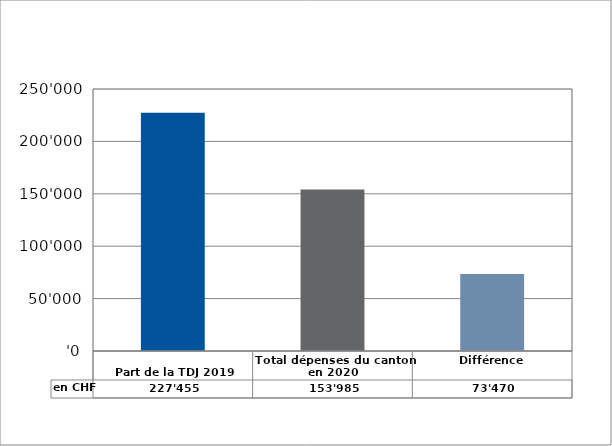
| Category | en CHF |
|---|---|
| 
Part de la TDJ 2019

 | 227455 |
| Total dépenses du canton en 2020 | 153985 |
| Différence | 73470 |